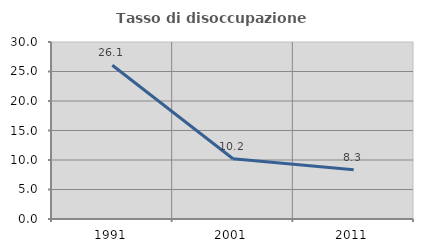
| Category | Tasso di disoccupazione giovanile  |
|---|---|
| 1991.0 | 26.05 |
| 2001.0 | 10.204 |
| 2011.0 | 8.333 |